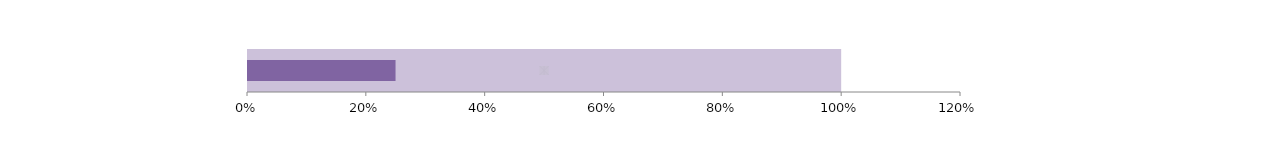
| Category | maximo |
|---|---|
| 0 | 1 |